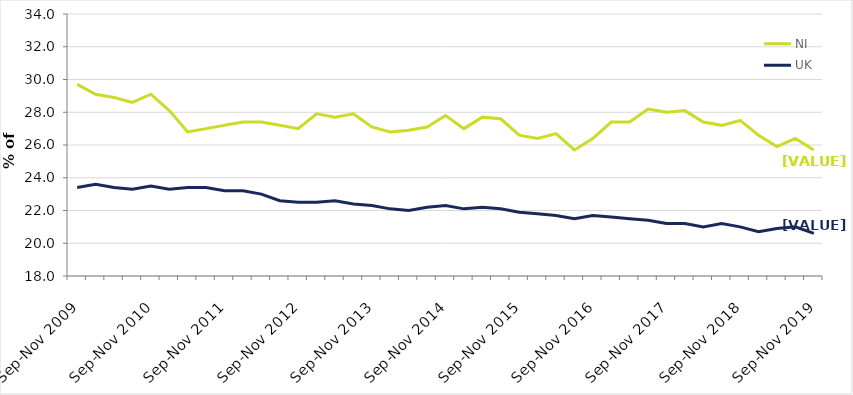
| Category | NI | UK |
|---|---|---|
| Sep-Nov 2009 | 29.7 | 23.4 |
| Dec-Feb 2010 | 29.1 | 23.6 |
| Mar-May 2010 | 28.9 | 23.4 |
| Jun-Aug 2010 | 28.6 | 23.3 |
| Sep-Nov 2010 | 29.1 | 23.5 |
| Dec-Feb 2011 | 28.1 | 23.3 |
| Mar-May 2011 | 26.8 | 23.4 |
| Jun-Aug 2011 | 27 | 23.4 |
| Sep-Nov 2011 | 27.2 | 23.2 |
| Dec-Feb 2012 | 27.4 | 23.2 |
| Mar-May 2012 | 27.4 | 23 |
| Jun-Aug 2012 | 27.2 | 22.6 |
| Sep-Nov 2012 | 27 | 22.5 |
| Dec-Feb 2013 | 27.9 | 22.5 |
| Mar-May 2013 | 27.7 | 22.6 |
| Jun-Aug 2013 | 27.9 | 22.4 |
| Sep-Nov 2013 | 27.1 | 22.3 |
| Dec-Feb 2014 | 26.8 | 22.1 |
| Mar-May 2014 | 26.9 | 22 |
| Jun-Aug 2014 | 27.1 | 22.2 |
| Sep-Nov 2014 | 27.8 | 22.3 |
| Dec-Feb 2015 | 27 | 22.1 |
| Mar-May 2015 | 27.7 | 22.2 |
| Jun-Aug 2015 | 27.6 | 22.1 |
| Sep-Nov 2015 | 26.6 | 21.9 |
| Dec-Feb 2016 | 26.4 | 21.8 |
| Mar-May 2016 | 26.7 | 21.7 |
| Jun-Aug 2016 | 25.7 | 21.5 |
| Sep-Nov 2016 | 26.4 | 21.7 |
| Dec-Feb 2017 | 27.4 | 21.6 |
| Mar-May 2017 | 27.4 | 21.5 |
| Jun-Aug 2017 | 28.2 | 21.4 |
| Sep-Nov 2017 | 28 | 21.2 |
| Dec-Feb 2018 | 28.1 | 21.2 |
| Mar-May 2018 | 27.4 | 21 |
| Jun-Aug 2018 | 27.2 | 21.2 |
| Sep-Nov 2018 | 27.5 | 21 |
| Dec-Feb 2019 | 26.6 | 20.7 |
| Mar-May 2019 | 25.9 | 20.9 |
| Jun-Aug 2019 | 26.4 | 21 |
| Sep-Nov 2019 | 25.7 | 20.6 |